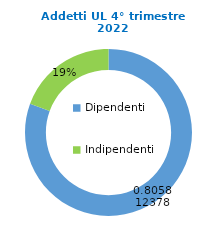
| Category | Series 0 |
|---|---|
| Dipendenti | 107638 |
| Indipendenti | 25939 |